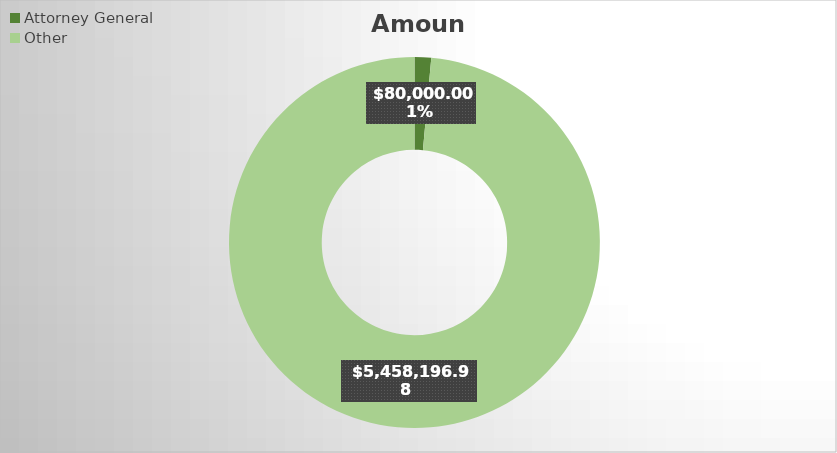
| Category | Amount |
|---|---|
| Attorney General | 80000 |
| Other | 5458196.98 |